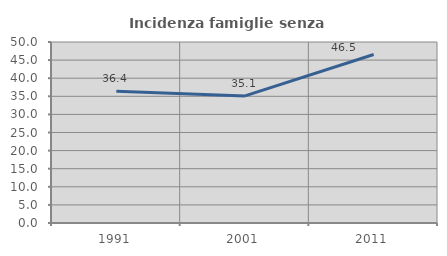
| Category | Incidenza famiglie senza nuclei |
|---|---|
| 1991.0 | 36.364 |
| 2001.0 | 35.102 |
| 2011.0 | 46.538 |